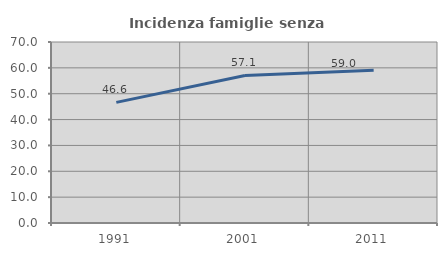
| Category | Incidenza famiglie senza nuclei |
|---|---|
| 1991.0 | 46.639 |
| 2001.0 | 57.073 |
| 2011.0 | 59.043 |